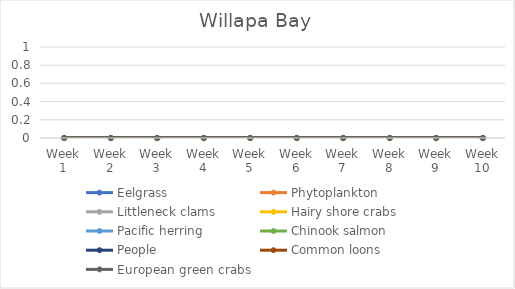
| Category | Eelgrass | Phytoplankton | Littleneck clams | Hairy shore crabs | Pacific herring | Chinook salmon | People | Common loons | European green crabs |
|---|---|---|---|---|---|---|---|---|---|
| Week 1 | 0 | 0 | 0 | 0 | 0 | 0 | 0 | 0 | 0 |
| Week 2 | 0 | 0 | 0 | 0 | 0 | 0 | 0 | 0 | 0 |
| Week 3 | 0 | 0 | 0 | 0 | 0 | 0 | 0 | 0 | 0 |
| Week 4 | 0 | 0 | 0 | 0 | 0 | 0 | 0 | 0 | 0 |
| Week 5 | 0 | 0 | 0 | 0 | 0 | 0 | 0 | 0 | 0 |
| Week 6 | 0 | 0 | 0 | 0 | 0 | 0 | 0 | 0 | 0 |
| Week 7 | 0 | 0 | 0 | 0 | 0 | 0 | 0 | 0 | 0 |
| Week 8 | 0 | 0 | 0 | 0 | 0 | 0 | 0 | 0 | 0 |
| Week 9 | 0 | 0 | 0 | 0 | 0 | 0 | 0 | 0 | 0 |
| Week 10 | 0 | 0 | 0 | 0 | 0 | 0 | 0 | 0 | 0 |